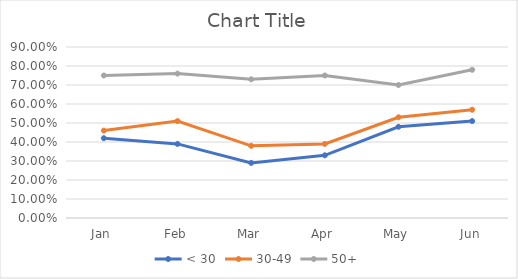
| Category | < 30 | 30-49 | 50+ |
|---|---|---|---|
| Jan | 0.42 | 0.46 | 0.75 |
| Feb | 0.39 | 0.51 | 0.76 |
| Mar | 0.29 | 0.38 | 0.73 |
| Apr | 0.33 | 0.39 | 0.75 |
| May | 0.48 | 0.53 | 0.7 |
| Jun | 0.51 | 0.57 | 0.78 |